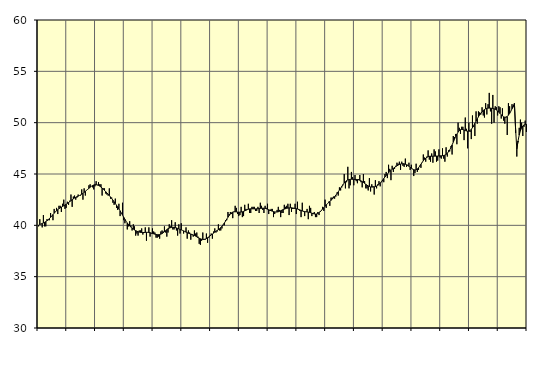
| Category | Samtliga fast anställda (inkl. fast anställda utomlands) | Series 1 |
|---|---|---|
| nan | 39.9 | 40.03 |
| 87.0 | 40.6 | 40.1 |
| 87.0 | 40.1 | 40.13 |
| 87.0 | 39.8 | 40.18 |
| 87.0 | 41 | 40.23 |
| 87.0 | 39.9 | 40.29 |
| 87.0 | 39.9 | 40.36 |
| 87.0 | 40.6 | 40.45 |
| 87.0 | 40.5 | 40.54 |
| 87.0 | 40.5 | 40.66 |
| 87.0 | 41.2 | 40.78 |
| 87.0 | 40.9 | 40.91 |
| nan | 40.5 | 41.05 |
| 88.0 | 41.6 | 41.18 |
| 88.0 | 41.3 | 41.31 |
| 88.0 | 41.7 | 41.43 |
| 88.0 | 41.1 | 41.53 |
| 88.0 | 41.9 | 41.62 |
| 88.0 | 41.9 | 41.7 |
| 88.0 | 41.3 | 41.77 |
| 88.0 | 42.1 | 41.84 |
| 88.0 | 42.5 | 41.91 |
| 88.0 | 41.6 | 41.98 |
| 88.0 | 41.7 | 42.05 |
| nan | 42.3 | 42.13 |
| 89.0 | 42 | 42.22 |
| 89.0 | 42.4 | 42.31 |
| 89.0 | 43 | 42.4 |
| 89.0 | 41.8 | 42.49 |
| 89.0 | 42.8 | 42.58 |
| 89.0 | 42.9 | 42.66 |
| 89.0 | 42.5 | 42.73 |
| 89.0 | 42.7 | 42.79 |
| 89.0 | 43 | 42.84 |
| 89.0 | 42.9 | 42.9 |
| 89.0 | 42.9 | 42.96 |
| nan | 43.5 | 43.03 |
| 90.0 | 42.5 | 43.12 |
| 90.0 | 43.6 | 43.21 |
| 90.0 | 42.9 | 43.31 |
| 90.0 | 43.4 | 43.41 |
| 90.0 | 43.5 | 43.51 |
| 90.0 | 43.9 | 43.61 |
| 90.0 | 44 | 43.71 |
| 90.0 | 43.8 | 43.8 |
| 90.0 | 43.7 | 43.87 |
| 90.0 | 43.5 | 43.93 |
| 90.0 | 43.8 | 43.96 |
| nan | 44.3 | 43.96 |
| 91.0 | 43.9 | 43.94 |
| 91.0 | 44.2 | 43.89 |
| 91.0 | 44 | 43.82 |
| 91.0 | 44 | 43.73 |
| 91.0 | 42.9 | 43.63 |
| 91.0 | 43.6 | 43.52 |
| 91.0 | 43.6 | 43.4 |
| 91.0 | 43.1 | 43.28 |
| 91.0 | 43 | 43.15 |
| 91.0 | 42.9 | 43.03 |
| 91.0 | 43.6 | 42.9 |
| nan | 42.6 | 42.76 |
| 92.0 | 42.7 | 42.61 |
| 92.0 | 42.2 | 42.45 |
| 92.0 | 42 | 42.29 |
| 92.0 | 42.6 | 42.13 |
| 92.0 | 41.7 | 41.96 |
| 92.0 | 41.5 | 41.79 |
| 92.0 | 42.1 | 41.61 |
| 92.0 | 40.9 | 41.41 |
| 92.0 | 41.2 | 41.21 |
| 92.0 | 42.2 | 41 |
| 92.0 | 40.5 | 40.79 |
| nan | 40.2 | 40.59 |
| 93.0 | 40.4 | 40.4 |
| 93.0 | 39.6 | 40.23 |
| 93.0 | 39.9 | 40.08 |
| 93.0 | 40.4 | 39.94 |
| 93.0 | 40 | 39.82 |
| 93.0 | 39.5 | 39.71 |
| 93.0 | 40.1 | 39.63 |
| 93.0 | 39.9 | 39.55 |
| 93.0 | 39 | 39.49 |
| 93.0 | 39.2 | 39.43 |
| 93.0 | 39 | 39.38 |
| nan | 39.5 | 39.34 |
| 94.0 | 39.5 | 39.31 |
| 94.0 | 39.7 | 39.3 |
| 94.0 | 39.1 | 39.3 |
| 94.0 | 39.3 | 39.3 |
| 94.0 | 39.8 | 39.31 |
| 94.0 | 38.5 | 39.32 |
| 94.0 | 39.3 | 39.32 |
| 94.0 | 39.8 | 39.31 |
| 94.0 | 38.9 | 39.28 |
| 94.0 | 39.2 | 39.25 |
| 94.0 | 39.7 | 39.21 |
| nan | 39.4 | 39.17 |
| 95.0 | 39.3 | 39.14 |
| 95.0 | 38.8 | 39.11 |
| 95.0 | 38.8 | 39.09 |
| 95.0 | 38.9 | 39.09 |
| 95.0 | 38.7 | 39.1 |
| 95.0 | 39.4 | 39.14 |
| 95.0 | 39.5 | 39.2 |
| 95.0 | 39.4 | 39.28 |
| 95.0 | 39.9 | 39.38 |
| 95.0 | 39.3 | 39.48 |
| 95.0 | 38.9 | 39.58 |
| nan | 39.3 | 39.67 |
| 96.0 | 40.1 | 39.73 |
| 96.0 | 39.9 | 39.77 |
| 96.0 | 40.5 | 39.8 |
| 96.0 | 39.6 | 39.81 |
| 96.0 | 39.6 | 39.8 |
| 96.0 | 40.3 | 39.78 |
| 96.0 | 39.5 | 39.75 |
| 96.0 | 39 | 39.7 |
| 96.0 | 40.1 | 39.65 |
| 96.0 | 39.2 | 39.6 |
| 96.0 | 40.2 | 39.56 |
| nan | 39.5 | 39.51 |
| 97.0 | 39.2 | 39.46 |
| 97.0 | 39.4 | 39.4 |
| 97.0 | 39.8 | 39.34 |
| 97.0 | 38.7 | 39.28 |
| 97.0 | 39.5 | 39.23 |
| 97.0 | 39.3 | 39.19 |
| 97.0 | 38.6 | 39.15 |
| 97.0 | 39.1 | 39.11 |
| 97.0 | 38.9 | 39.06 |
| 97.0 | 39.5 | 39.01 |
| 97.0 | 39.2 | 38.95 |
| nan | 39.3 | 38.88 |
| 98.0 | 38.9 | 38.81 |
| 98.0 | 38.2 | 38.75 |
| 98.0 | 38.1 | 38.69 |
| 98.0 | 38.5 | 38.65 |
| 98.0 | 39.3 | 38.63 |
| 98.0 | 38.6 | 38.63 |
| 98.0 | 38.6 | 38.66 |
| 98.0 | 39.2 | 38.71 |
| 98.0 | 38.3 | 38.79 |
| 98.0 | 38.8 | 38.87 |
| 98.0 | 39 | 38.96 |
| nan | 39.2 | 39.06 |
| 99.0 | 38.7 | 39.15 |
| 99.0 | 39.4 | 39.24 |
| 99.0 | 39.7 | 39.34 |
| 99.0 | 39.3 | 39.42 |
| 99.0 | 39.4 | 39.5 |
| 99.0 | 40.1 | 39.58 |
| 99.0 | 39.5 | 39.67 |
| 99.0 | 39.5 | 39.78 |
| 99.0 | 39.7 | 39.91 |
| 99.0 | 40 | 40.06 |
| 99.0 | 40 | 40.23 |
| nan | 40.5 | 40.41 |
| 0.0 | 40.5 | 40.61 |
| 0.0 | 41.3 | 40.79 |
| 0.0 | 41.1 | 40.96 |
| 0.0 | 41.3 | 41.11 |
| 0.0 | 41.1 | 41.22 |
| 0.0 | 40.7 | 41.29 |
| 0.0 | 41.3 | 41.32 |
| 0.0 | 41.9 | 41.32 |
| 0.0 | 41.7 | 41.31 |
| 0.0 | 41.1 | 41.29 |
| 0.0 | 40.9 | 41.28 |
| nan | 41 | 41.28 |
| 1.0 | 41.8 | 41.3 |
| 1.0 | 40.8 | 41.32 |
| 1.0 | 40.9 | 41.36 |
| 1.0 | 42 | 41.41 |
| 1.0 | 41.6 | 41.47 |
| 1.0 | 41.5 | 41.52 |
| 1.0 | 42.1 | 41.57 |
| 1.0 | 41.2 | 41.6 |
| 1.0 | 41.2 | 41.61 |
| 1.0 | 41.8 | 41.61 |
| 1.0 | 41.8 | 41.61 |
| nan | 41.8 | 41.6 |
| 2.0 | 41.4 | 41.6 |
| 2.0 | 41.4 | 41.61 |
| 2.0 | 41.8 | 41.62 |
| 2.0 | 41.2 | 41.63 |
| 2.0 | 42.2 | 41.65 |
| 2.0 | 41.9 | 41.66 |
| 2.0 | 41.5 | 41.67 |
| 2.0 | 41.2 | 41.67 |
| 2.0 | 41.9 | 41.66 |
| 2.0 | 41.7 | 41.62 |
| 2.0 | 42.1 | 41.57 |
| nan | 41.1 | 41.52 |
| 3.0 | 41.4 | 41.47 |
| 3.0 | 41.6 | 41.42 |
| 3.0 | 41.6 | 41.38 |
| 3.0 | 40.8 | 41.34 |
| 3.0 | 41.1 | 41.31 |
| 3.0 | 41.3 | 41.3 |
| 3.0 | 41.5 | 41.3 |
| 3.0 | 41.8 | 41.32 |
| 3.0 | 41.5 | 41.37 |
| 3.0 | 40.8 | 41.42 |
| 3.0 | 41.2 | 41.48 |
| nan | 41.2 | 41.53 |
| 4.0 | 42 | 41.58 |
| 4.0 | 41.8 | 41.62 |
| 4.0 | 41.9 | 41.66 |
| 4.0 | 42.1 | 41.68 |
| 4.0 | 41 | 41.7 |
| 4.0 | 42.1 | 41.71 |
| 4.0 | 41.3 | 41.71 |
| 4.0 | 41.6 | 41.69 |
| 4.0 | 41.6 | 41.67 |
| 4.0 | 42.1 | 41.65 |
| 4.0 | 41.1 | 41.62 |
| nan | 42.3 | 41.59 |
| 5.0 | 41.5 | 41.55 |
| 5.0 | 41.4 | 41.5 |
| 5.0 | 40.8 | 41.45 |
| 5.0 | 42.2 | 41.4 |
| 5.0 | 41.4 | 41.36 |
| 5.0 | 40.9 | 41.34 |
| 5.0 | 41.3 | 41.32 |
| 5.0 | 41.6 | 41.31 |
| 5.0 | 40.6 | 41.29 |
| 5.0 | 41.9 | 41.27 |
| 5.0 | 41.7 | 41.23 |
| nan | 40.9 | 41.19 |
| 6.0 | 41.2 | 41.14 |
| 6.0 | 41.3 | 41.11 |
| 6.0 | 40.8 | 41.1 |
| 6.0 | 40.8 | 41.11 |
| 6.0 | 41.3 | 41.16 |
| 6.0 | 41 | 41.23 |
| 6.0 | 41.4 | 41.33 |
| 6.0 | 41.5 | 41.45 |
| 6.0 | 41.8 | 41.59 |
| 6.0 | 41.4 | 41.73 |
| 6.0 | 42.5 | 41.86 |
| nan | 41.7 | 41.99 |
| 7.0 | 42.1 | 42.11 |
| 7.0 | 42.3 | 42.22 |
| 7.0 | 41.9 | 42.33 |
| 7.0 | 42.7 | 42.44 |
| 7.0 | 42.7 | 42.55 |
| 7.0 | 42.8 | 42.67 |
| 7.0 | 42.6 | 42.8 |
| 7.0 | 42.8 | 42.94 |
| 7.0 | 43.2 | 43.09 |
| 7.0 | 42.9 | 43.26 |
| 7.0 | 43.7 | 43.44 |
| nan | 43.4 | 43.62 |
| 8.0 | 43.7 | 43.8 |
| 8.0 | 43.9 | 43.97 |
| 8.0 | 45 | 44.12 |
| 8.0 | 43.6 | 44.25 |
| 8.0 | 44.2 | 44.35 |
| 8.0 | 45.7 | 44.42 |
| 8.0 | 43.6 | 44.46 |
| 8.0 | 43.9 | 44.48 |
| 8.0 | 45.2 | 44.49 |
| 8.0 | 44.7 | 44.48 |
| 8.0 | 43.9 | 44.48 |
| nan | 44.9 | 44.47 |
| 9.0 | 44.3 | 44.47 |
| 9.0 | 44.1 | 44.46 |
| 9.0 | 44.5 | 44.43 |
| 9.0 | 44.9 | 44.39 |
| 9.0 | 44.2 | 44.33 |
| 9.0 | 43.7 | 44.26 |
| 9.0 | 45 | 44.18 |
| 9.0 | 44.3 | 44.09 |
| 9.0 | 43.6 | 44 |
| 9.0 | 43.6 | 43.91 |
| 9.0 | 43.4 | 43.84 |
| nan | 44.6 | 43.78 |
| 10.0 | 43.3 | 43.74 |
| 10.0 | 44 | 43.73 |
| 10.0 | 43.8 | 43.73 |
| 10.0 | 43 | 43.75 |
| 10.0 | 44.4 | 43.78 |
| 10.0 | 43.6 | 43.83 |
| 10.0 | 44 | 43.9 |
| 10.0 | 44.3 | 43.99 |
| 10.0 | 43.8 | 44.11 |
| 10.0 | 44.2 | 44.25 |
| 10.0 | 44.3 | 44.41 |
| nan | 44.2 | 44.56 |
| 11.0 | 45 | 44.71 |
| 11.0 | 45.2 | 44.86 |
| 11.0 | 44.6 | 44.99 |
| 11.0 | 45.9 | 45.12 |
| 11.0 | 45.5 | 45.24 |
| 11.0 | 44.4 | 45.35 |
| 11.0 | 45.8 | 45.46 |
| 11.0 | 45.2 | 45.55 |
| 11.0 | 45.5 | 45.64 |
| 11.0 | 45.8 | 45.72 |
| 11.0 | 46.1 | 45.8 |
| nan | 46 | 45.87 |
| 12.0 | 46.2 | 45.93 |
| 12.0 | 45.4 | 45.97 |
| 12.0 | 46.2 | 46 |
| 12.0 | 45.8 | 46 |
| 12.0 | 45.7 | 45.99 |
| 12.0 | 46.5 | 45.95 |
| 12.0 | 45.7 | 45.9 |
| 12.0 | 45.9 | 45.83 |
| 12.0 | 46.1 | 45.75 |
| 12.0 | 45.4 | 45.66 |
| 12.0 | 45.9 | 45.56 |
| nan | 45.5 | 45.48 |
| 13.0 | 44.8 | 45.42 |
| 13.0 | 45.1 | 45.39 |
| 13.0 | 46 | 45.42 |
| 13.0 | 45.2 | 45.49 |
| 13.0 | 45.4 | 45.61 |
| 13.0 | 45.8 | 45.77 |
| 13.0 | 45.6 | 45.95 |
| 13.0 | 46.1 | 46.13 |
| 13.0 | 46.9 | 46.29 |
| 13.0 | 46.6 | 46.43 |
| 13.0 | 46.2 | 46.55 |
| nan | 46.7 | 46.63 |
| 14.0 | 47.3 | 46.69 |
| 14.0 | 46.4 | 46.72 |
| 14.0 | 46.2 | 46.73 |
| 14.0 | 47 | 46.73 |
| 14.0 | 46.1 | 46.73 |
| 14.0 | 47.4 | 46.74 |
| 14.0 | 47.2 | 46.74 |
| 14.0 | 46.2 | 46.75 |
| 14.0 | 46.3 | 46.75 |
| 14.0 | 47.4 | 46.76 |
| 14.0 | 46.6 | 46.77 |
| nan | 46.5 | 46.77 |
| 15.0 | 47.5 | 46.78 |
| 15.0 | 46.5 | 46.8 |
| 15.0 | 46.2 | 46.84 |
| 15.0 | 47.6 | 46.91 |
| 15.0 | 46.7 | 47.02 |
| 15.0 | 47.3 | 47.16 |
| 15.0 | 47.2 | 47.34 |
| 15.0 | 47.7 | 47.57 |
| 15.0 | 46.9 | 47.83 |
| 15.0 | 48.7 | 48.1 |
| 15.0 | 48.6 | 48.38 |
| nan | 48.9 | 48.65 |
| 16.0 | 47.9 | 48.88 |
| 16.0 | 50 | 49.08 |
| 16.0 | 49.5 | 49.22 |
| 16.0 | 48.9 | 49.31 |
| 16.0 | 49.6 | 49.34 |
| 16.0 | 49.6 | 49.33 |
| 16.0 | 48.3 | 49.29 |
| 16.0 | 50.5 | 49.23 |
| 16.0 | 49.4 | 49.19 |
| 16.0 | 47.5 | 49.17 |
| 16.0 | 50 | 49.18 |
| nan | 49.1 | 49.23 |
| 17.0 | 48.4 | 49.35 |
| 17.0 | 50.7 | 49.51 |
| 17.0 | 49.6 | 49.71 |
| 17.0 | 48.7 | 49.94 |
| 17.0 | 51.1 | 50.16 |
| 17.0 | 49.9 | 50.37 |
| 17.0 | 51.1 | 50.58 |
| 17.0 | 51 | 50.76 |
| 17.0 | 50.8 | 50.92 |
| 17.0 | 51.5 | 51.06 |
| 17.0 | 50.7 | 51.19 |
| nan | 50.5 | 51.28 |
| 18.0 | 51.9 | 51.35 |
| 18.0 | 50.8 | 51.4 |
| 18.0 | 51.8 | 51.42 |
| 18.0 | 52.9 | 51.42 |
| 18.0 | 51.1 | 51.42 |
| 18.0 | 49.9 | 51.4 |
| 18.0 | 52.7 | 51.38 |
| 18.0 | 50 | 51.35 |
| 18.0 | 51.6 | 51.3 |
| 18.0 | 51.5 | 51.23 |
| 18.0 | 50.7 | 51.14 |
| nan | 51.6 | 51.02 |
| 19.0 | 51.5 | 50.89 |
| 19.0 | 50.4 | 50.77 |
| 19.0 | 51.4 | 50.65 |
| 19.0 | 50.2 | 50.57 |
| 19.0 | 49.9 | 50.53 |
| 19.0 | 50.5 | 50.54 |
| 19.0 | 48.8 | 50.61 |
| 19.0 | 51.9 | 50.73 |
| 19.0 | 51.6 | 50.9 |
| 19.0 | 51.1 | 51.11 |
| 19.0 | 51.8 | 51.35 |
| nan | 51.5 | 51.61 |
| 20.0 | 51.6 | 51.87 |
| 20.0 | 49 | 49.32 |
| 20.0 | 46.7 | 47.39 |
| 20.0 | 48.1 | 48.21 |
| 20.0 | 49.5 | 48.79 |
| 20.0 | 50.3 | 49.21 |
| 20.0 | 50 | 49.49 |
| 20.0 | 48.7 | 49.68 |
| 20.0 | 49.6 | 49.78 |
| 20.0 | 50.2 | 49.83 |
| 20.0 | 49.1 | 49.85 |